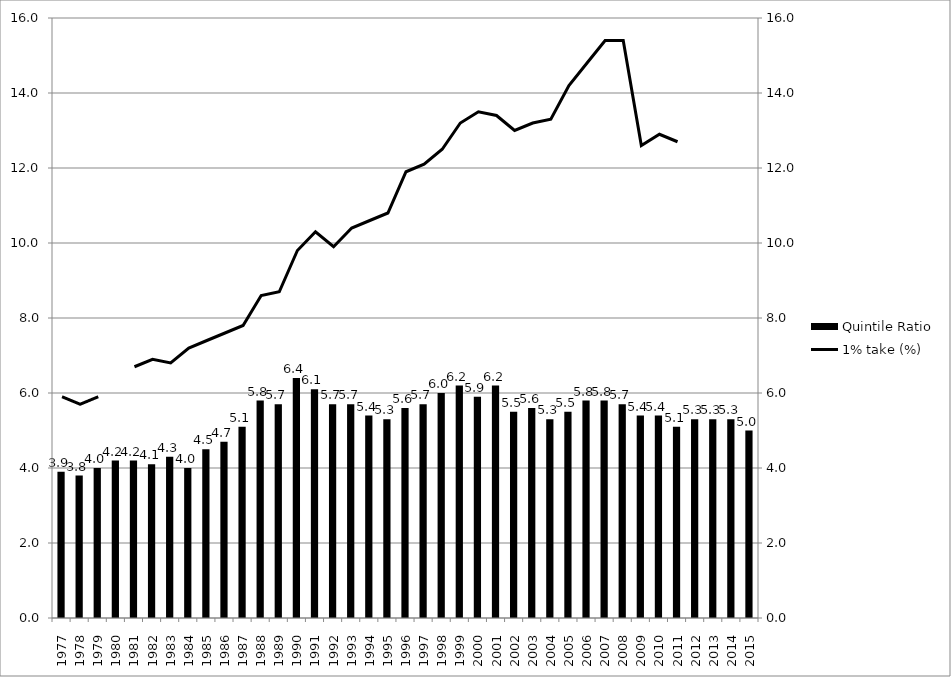
| Category | Quintile Ratio |
|---|---|
| 1977.0 | 3.9 |
| 1978.0 | 3.8 |
| 1979.0 | 4 |
| 1980.0 | 4.2 |
| 1981.0 | 4.2 |
| 1982.0 | 4.1 |
| 1983.0 | 4.3 |
| 1984.0 | 4 |
| 1985.0 | 4.5 |
| 1986.0 | 4.7 |
| 1987.0 | 5.1 |
| 1988.0 | 5.8 |
| 1989.0 | 5.7 |
| 1990.0 | 6.4 |
| 1991.0 | 6.1 |
| 1992.0 | 5.7 |
| 1993.0 | 5.7 |
| 1994.0 | 5.4 |
| 1995.0 | 5.3 |
| 1996.0 | 5.6 |
| 1997.0 | 5.7 |
| 1998.0 | 6 |
| 1999.0 | 6.2 |
| 2000.0 | 5.9 |
| 2001.0 | 6.2 |
| 2002.0 | 5.5 |
| 2003.0 | 5.6 |
| 2004.0 | 5.3 |
| 2005.0 | 5.5 |
| 2006.0 | 5.8 |
| 2007.0 | 5.8 |
| 2008.0 | 5.7 |
| 2009.0 | 5.4 |
| 2010.0 | 5.4 |
| 2011.0 | 5.1 |
| 2012.0 | 5.3 |
| 2013.0 | 5.3 |
| 2014.0 | 5.3 |
| 2015.0 | 5 |